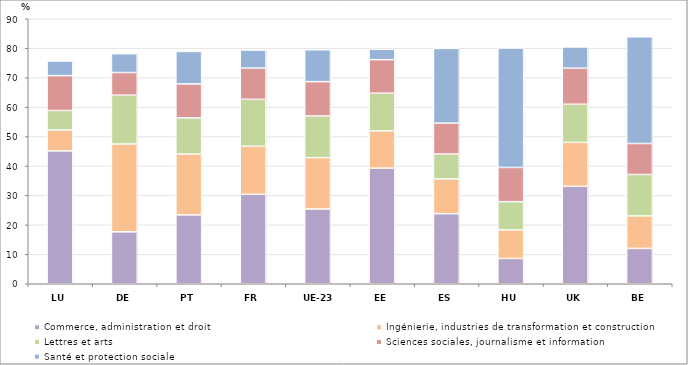
| Category | Commerce, administration et droit | Ingénierie, industries de transformation et construction | Lettres et arts | Sciences sociales, journalisme et information | Santé et protection sociale |
|---|---|---|---|---|---|
| LU | 45.118 | 7.095 | 6.64 | 11.825 | 4.973 |
| DE | 17.638 | 29.827 | 16.579 | 7.691 | 6.402 |
| PT | 23.391 | 20.647 | 12.293 | 11.536 | 11.026 |
| FR | 30.377 | 16.315 | 15.952 | 10.588 | 6.144 |
| UE-23 | 25.388 | 17.439 | 14.154 | 11.657 | 10.841 |
| EE | 39.265 | 12.637 | 12.816 | 11.386 | 3.523 |
| ES | 23.796 | 11.809 | 8.451 | 10.498 | 25.382 |
| HU | 8.59 | 9.698 | 9.591 | 11.627 | 40.564 |
| UK | 33.101 | 14.921 | 12.938 | 12.234 | 7.232 |
| BE | 12.001 | 11.037 | 14.071 | 10.528 | 36.229 |